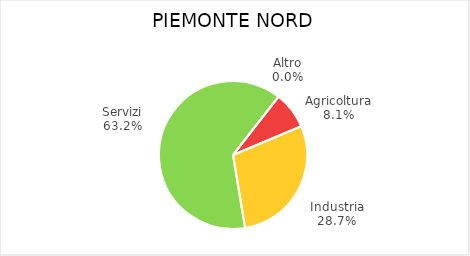
| Category | Piemonte Nord |
|---|---|
| Agricoltura | 8084 |
| Industria | 28733 |
| Servizi | 63132 |
| Altro | 16 |